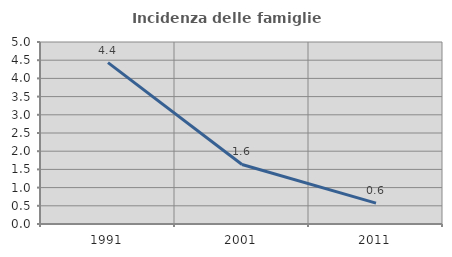
| Category | Incidenza delle famiglie numerose |
|---|---|
| 1991.0 | 4.432 |
| 2001.0 | 1.636 |
| 2011.0 | 0.574 |